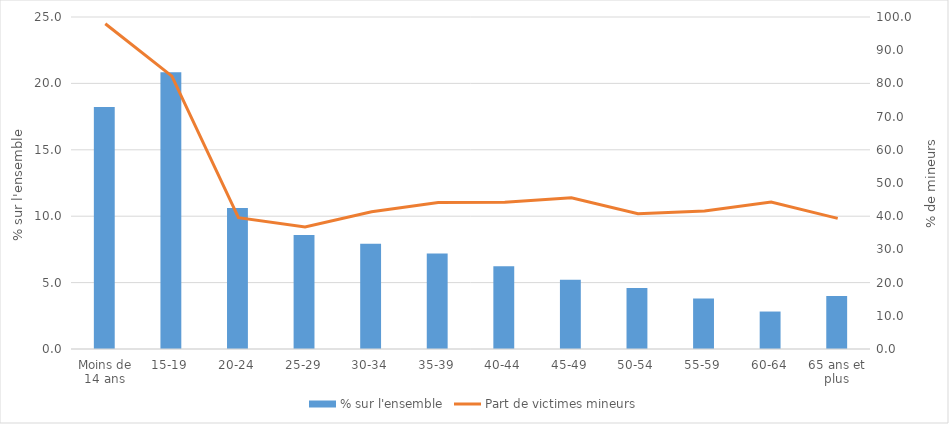
| Category | % sur l'ensemble |
|---|---|
| Moins de 14 ans | 18.225 |
| 15-19 | 20.831 |
| 20-24 | 10.609 |
| 25-29 | 8.577 |
| 30-34 | 7.921 |
| 35-39 | 7.182 |
| 40-44 | 6.24 |
| 45-49 | 5.221 |
| 50-54 | 4.586 |
| 55-59 | 3.797 |
| 60-64 | 2.821 |
| 65 ans et plus | 3.991 |